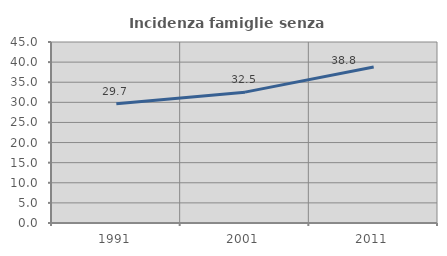
| Category | Incidenza famiglie senza nuclei |
|---|---|
| 1991.0 | 29.653 |
| 2001.0 | 32.533 |
| 2011.0 | 38.78 |